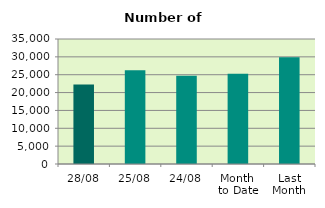
| Category | Series 0 |
|---|---|
| 28/08 | 22256 |
| 25/08 | 26236 |
| 24/08 | 24686 |
| Month 
to Date | 25272.7 |
| Last
Month | 29864.476 |